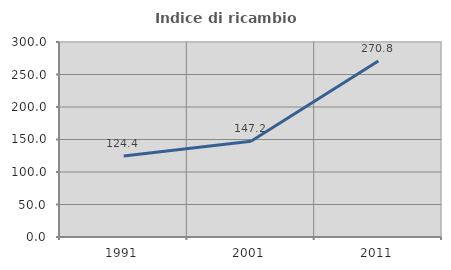
| Category | Indice di ricambio occupazionale  |
|---|---|
| 1991.0 | 124.444 |
| 2001.0 | 147.222 |
| 2011.0 | 270.833 |